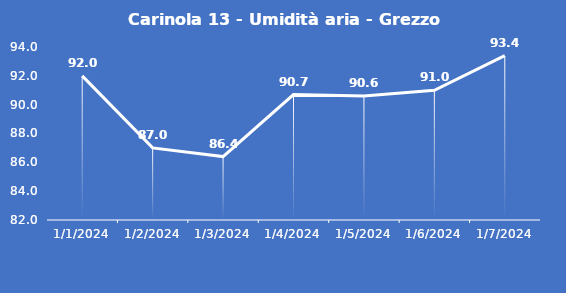
| Category | Carinola 13 - Umidità aria - Grezzo (%) |
|---|---|
| 1/1/24 | 92 |
| 1/2/24 | 87 |
| 1/3/24 | 86.4 |
| 1/4/24 | 90.7 |
| 1/5/24 | 90.6 |
| 1/6/24 | 91 |
| 1/7/24 | 93.4 |